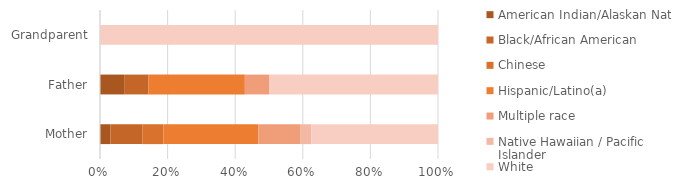
| Category | American Indian/Alaskan Native | Black/African American | Chinese | Hispanic/Latino(a) | Multiple race | Native Hawaiian / Pacific Islander | White |
|---|---|---|---|---|---|---|---|
| Mother | 0.031 | 0.094 | 0.062 | 0.281 | 0.125 | 0.031 | 0.375 |
| Father | 0.071 | 0.071 | 0 | 0.286 | 0.071 | 0 | 0.5 |
| Grandparent | 0 | 0 | 0 | 0 | 0 | 0 | 1 |